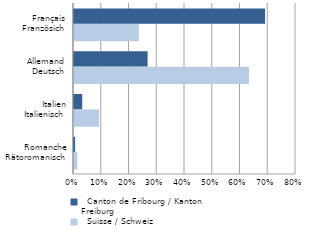
| Category |   Suisse / Schweiz |   Canton de Fribourg / Kanton Freiburg |
|---|---|---|
|       Romanche
Rätoromanisch | 0.005 | 0 |
|       Italien
Italienisch | 0.083 | 0.026 |
| Allemand
  Deutsch | 0.623 | 0.262 |
|    Français
Französich | 0.226 | 0.685 |